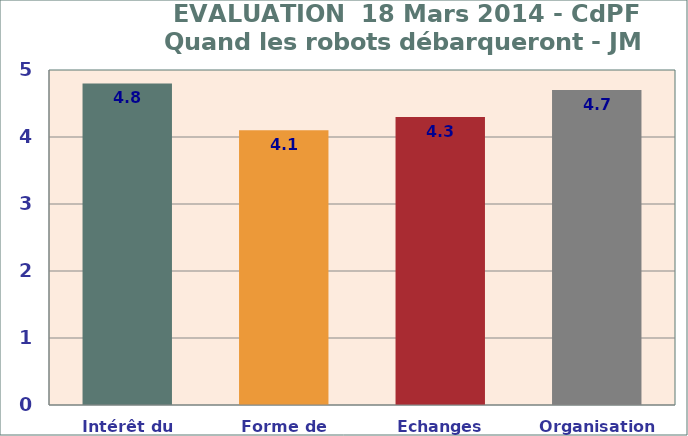
| Category | Series 0 |
|---|---|
| Intérêt du sujet | 4.8 |
| Forme de l'intervention | 4.1 |
| Echanges Participants | 4.3 |
| Organisation Intervention | 4.7 |